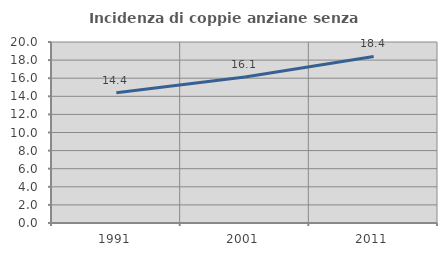
| Category | Incidenza di coppie anziane senza figli  |
|---|---|
| 1991.0 | 14.403 |
| 2001.0 | 16.136 |
| 2011.0 | 18.4 |